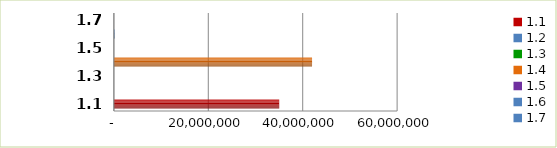
| Category | Series 0 |
|---|---|
| 1.1 | 35022080.14 |
| 1.2 | 0 |
| 1.3 | 0 |
| 1.4 | 41984709.62 |
| 1.5 | 0 |
| 1.6 | 151343.68 |
| 1.7 | 37.12 |